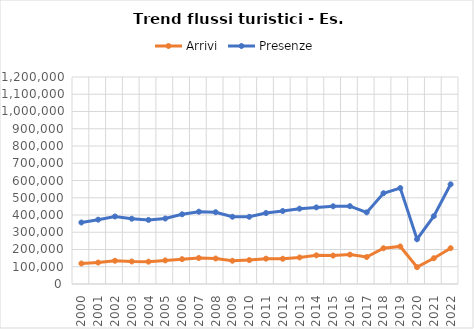
| Category | Arrivi | Presenze |
|---|---|---|
| 2000.0 | 118878 | 356562 |
| 2001.0 | 124489 | 372959 |
| 2002.0 | 134710 | 391347 |
| 2003.0 | 130557 | 378464 |
| 2004.0 | 129507 | 371441 |
| 2005.0 | 136707 | 379518 |
| 2006.0 | 143941 | 404076 |
| 2007.0 | 150666 | 419120 |
| 2008.0 | 147773 | 416219 |
| 2009.0 | 134826 | 389994 |
| 2010.0 | 138535 | 389579 |
| 2011.0 | 146839 | 411405 |
| 2012.0 | 146345 | 422961 |
| 2013.0 | 153844 | 436765 |
| 2014.0 | 166229 | 444066 |
| 2015.0 | 164874 | 450741 |
| 2016.0 | 170357 | 451217 |
| 2017.0 | 156494 | 415192 |
| 2018.0 | 207225 | 526149 |
| 2019.0 | 217683 | 556185 |
| 2020.0 | 97445 | 259668 |
| 2021.0 | 149350 | 393273 |
| 2022.0 | 207574 | 577931 |